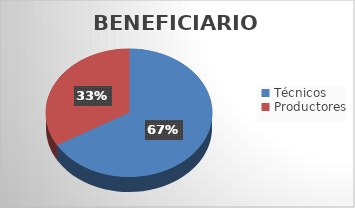
| Category | Series 0 |
|---|---|
| Técnicos | 207 |
| Productores | 104 |